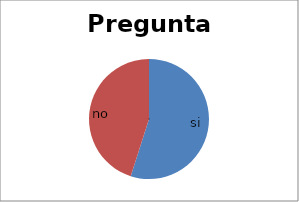
| Category | Series 0 |
|---|---|
| si | 178 |
| no | 146 |